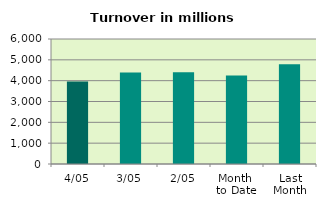
| Category | Series 0 |
|---|---|
| 4/05 | 3954.744 |
| 3/05 | 4392.391 |
| 2/05 | 4406.705 |
| Month 
to Date | 4251.28 |
| Last
Month | 4785.141 |